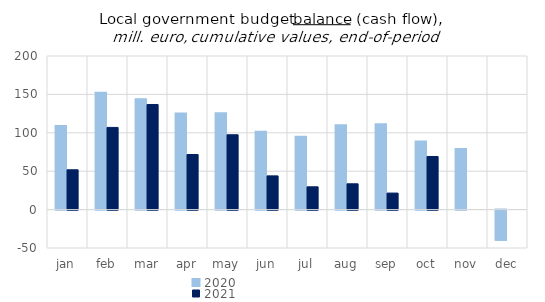
| Category | 2020 | 2021 |
|---|---|---|
| jan | 108823.125 | 51841.777 |
| feb | 152159.199 | 107011.894 |
| mar | 143649 | 136866.315 |
| apr | 125121 | 71755.584 |
| may | 125388.19 | 97451.146 |
| jun | 101368 | 43904.827 |
| jul | 94979.467 | 29653.452 |
| aug | 109691.166 | 33579 |
| sep | 111090.826 | 21501.571 |
| oct | 88540.96 | 69163.685 |
| nov | 78987.441 | 0 |
| dec | -39396.371 | 0 |